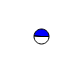
| Category | Series 0 |
|---|---|
| 0 | 8732 |
| 1 | 8302 |